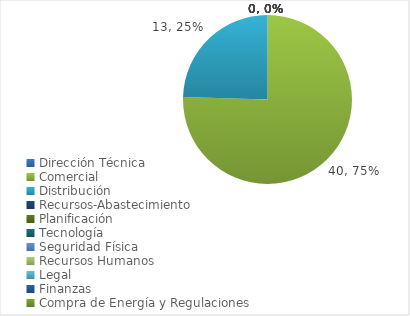
| Category | Series 0 |
|---|---|
| Dirección Técnica | 0 |
| Comercial | 40 |
| Distribución | 13 |
| Recursos-Abastecimiento | 0 |
| Planificación | 0 |
| Tecnología | 0 |
| Seguridad Física | 0 |
| Recursos Humanos | 0 |
| Legal | 0 |
| Finanzas | 0 |
| Compra de Energía y Regulaciones | 0 |